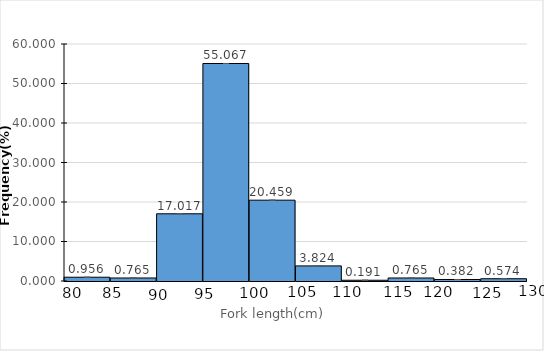
| Category | fi |
|---|---|
| 80-85 | 0.956 |
| 85-90 | 0.765 |
| 90-95 | 17.017 |
| 95-100 | 55.067 |
| 100-105 | 20.459 |
| 105-110 | 3.824 |
| 110-115 | 0.191 |
| 115-120 | 0.765 |
| 120-125 | 0.382 |
| 125-130 | 0.574 |